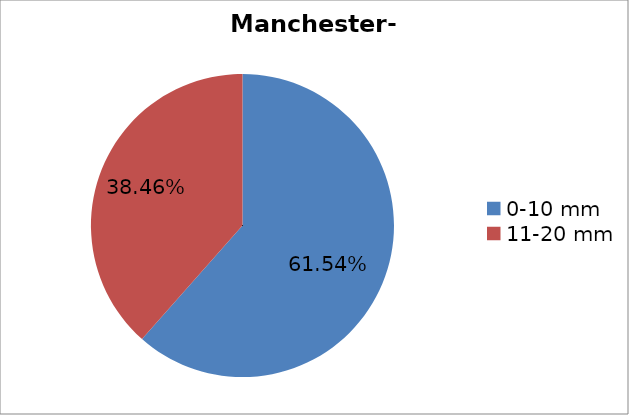
| Category | Series 0 |
|---|---|
| 0-10 mm | 0.615 |
| 11-20 mm | 0.385 |